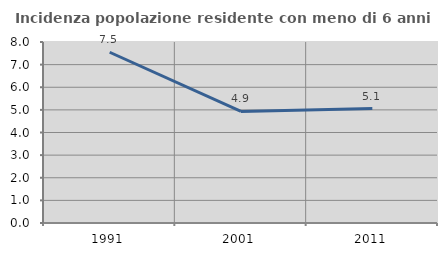
| Category | Incidenza popolazione residente con meno di 6 anni |
|---|---|
| 1991.0 | 7.547 |
| 2001.0 | 4.932 |
| 2011.0 | 5.06 |